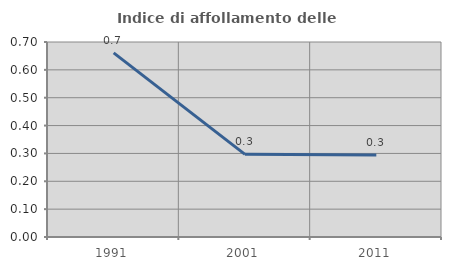
| Category | Indice di affollamento delle abitazioni  |
|---|---|
| 1991.0 | 0.661 |
| 2001.0 | 0.297 |
| 2011.0 | 0.295 |